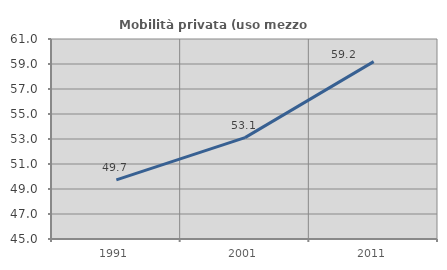
| Category | Mobilità privata (uso mezzo privato) |
|---|---|
| 1991.0 | 49.733 |
| 2001.0 | 53.11 |
| 2011.0 | 59.187 |